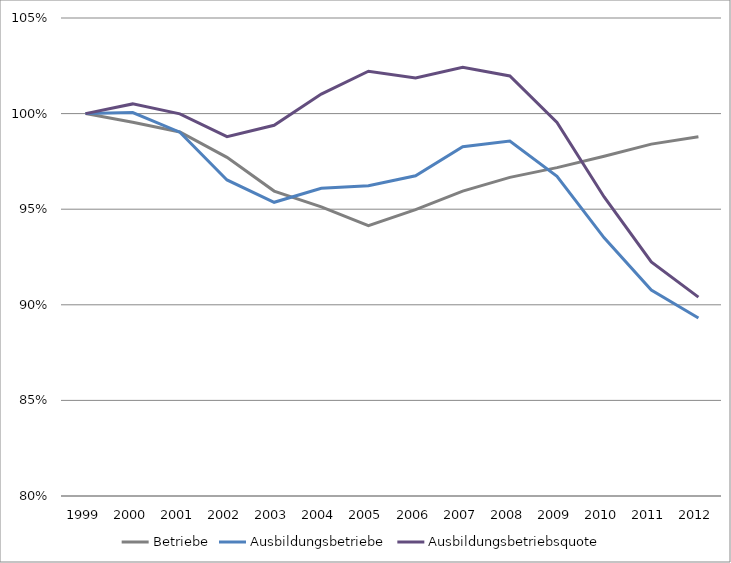
| Category | Betriebe | Ausbildungsbetriebe | Ausbildungsbetriebsquote |
|---|---|---|---|
| 1999.0 | 1 | 1 | 1 |
| 2000.0 | 0.995 | 1.001 | 1.005 |
| 2001.0 | 0.99 | 0.99 | 1 |
| 2002.0 | 0.977 | 0.965 | 0.988 |
| 2003.0 | 0.959 | 0.954 | 0.994 |
| 2004.0 | 0.951 | 0.961 | 1.01 |
| 2005.0 | 0.941 | 0.962 | 1.022 |
| 2006.0 | 0.95 | 0.967 | 1.019 |
| 2007.0 | 0.959 | 0.983 | 1.024 |
| 2008.0 | 0.967 | 0.986 | 1.02 |
| 2009.0 | 0.972 | 0.967 | 0.995 |
| 2010.0 | 0.978 | 0.935 | 0.956 |
| 2011.0 | 0.984 | 0.908 | 0.922 |
| 2012.0 | 0.988 | 0.893 | 0.904 |